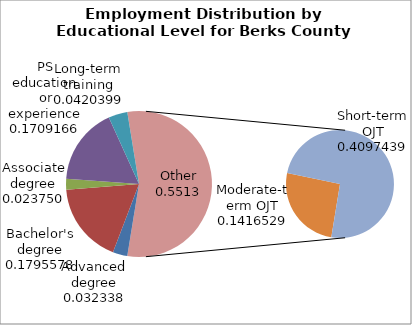
| Category | Series 0 |
|---|---|
| Advanced degree | 6100 |
| Bachelor's degree | 33870 |
| Associate degree | 4480 |
| PS education or experience | 32240 |
| Long-term training | 7930 |
| Moderate-term OJT | 26720 |
| Short-term OJT | 77290 |